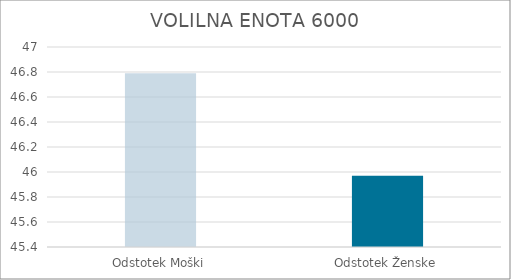
| Category | Series 0 |
|---|---|
| Odstotek Moški | 46.79 |
| Odstotek Ženske | 45.97 |